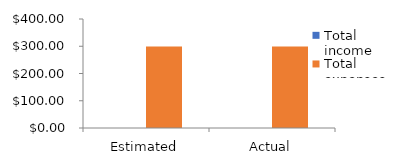
| Category | Total income | Total expenses |
|---|---|---|
| Estimated | 0 | 299 |
| Actual | 0 | 299 |